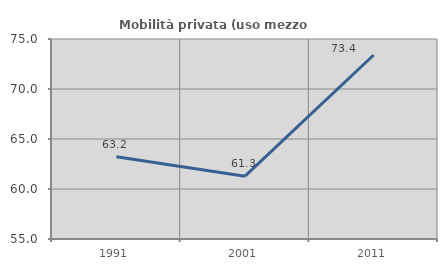
| Category | Mobilità privata (uso mezzo privato) |
|---|---|
| 1991.0 | 63.221 |
| 2001.0 | 61.284 |
| 2011.0 | 73.4 |